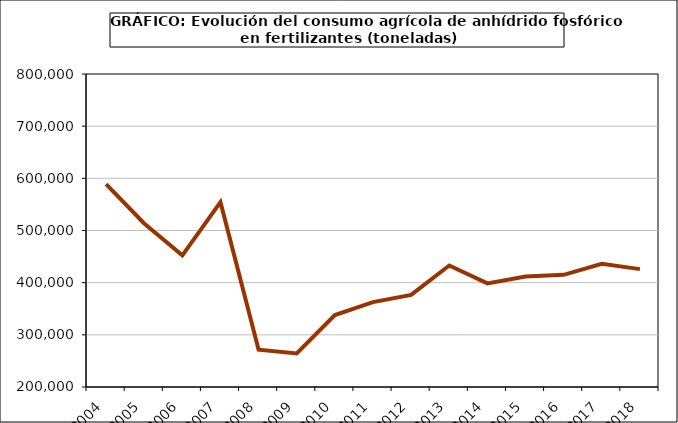
| Category | fertilizantes |
|---|---|
| 2004.0 | 588820 |
| 2005.0 | 513454 |
| 2006.0 | 452461 |
| 2007.0 | 554382 |
| 2008.0 | 271578 |
| 2009.0 | 264211 |
| 2010.0 | 337812 |
| 2011.0 | 362672 |
| 2012.0 | 376590 |
| 2013.0 | 432904 |
| 2014.0 | 398580 |
| 2015.0 | 411763 |
| 2016.0 | 414974 |
| 2017.0 | 436110 |
| 2018.0 | 425960 |